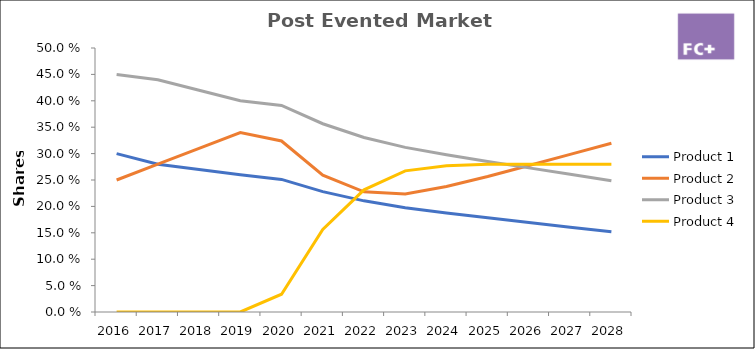
| Category | Product 1 | Product 2 | Product 3 | Product 4 |
|---|---|---|---|---|
| 2016.0 | 0.3 | 0.25 | 0.45 | 0 |
| 2017.0 | 0.28 | 0.28 | 0.44 | 0 |
| 2018.0 | 0.27 | 0.31 | 0.42 | 0 |
| 2019.0 | 0.26 | 0.34 | 0.4 | 0 |
| 2020.0 | 0.251 | 0.324 | 0.391 | 0.034 |
| 2021.0 | 0.228 | 0.259 | 0.357 | 0.156 |
| 2022.0 | 0.211 | 0.228 | 0.331 | 0.231 |
| 2023.0 | 0.198 | 0.223 | 0.312 | 0.267 |
| 2024.0 | 0.188 | 0.238 | 0.298 | 0.277 |
| 2025.0 | 0.178 | 0.256 | 0.285 | 0.28 |
| 2026.0 | 0.17 | 0.277 | 0.273 | 0.28 |
| 2027.0 | 0.161 | 0.298 | 0.261 | 0.28 |
| 2028.0 | 0.152 | 0.319 | 0.249 | 0.28 |